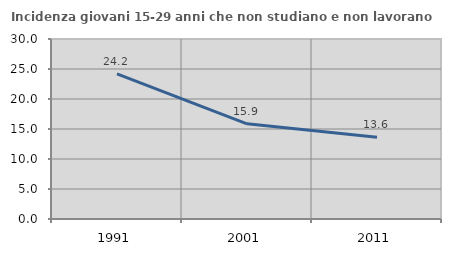
| Category | Incidenza giovani 15-29 anni che non studiano e non lavorano  |
|---|---|
| 1991.0 | 24.186 |
| 2001.0 | 15.862 |
| 2011.0 | 13.636 |